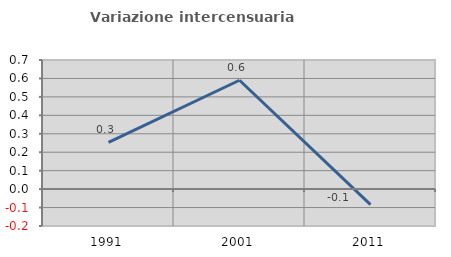
| Category | Variazione intercensuaria annua |
|---|---|
| 1991.0 | 0.253 |
| 2001.0 | 0.59 |
| 2011.0 | -0.084 |